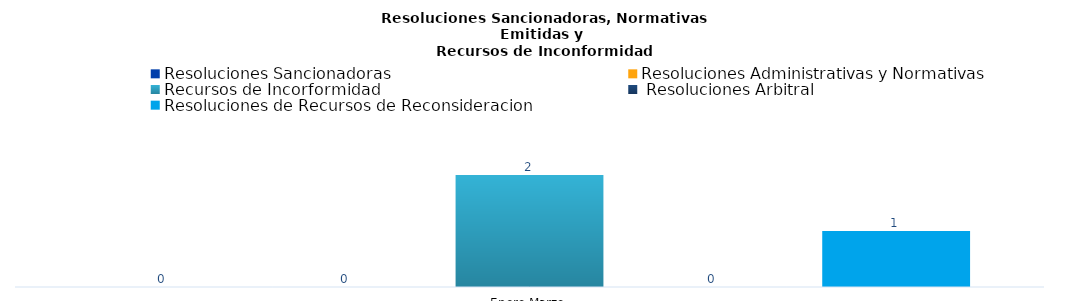
| Category | Resoluciones Sancionadoras | Resoluciones Administrativas y Normativas | Recursos de Incorformidad |  Resoluciones Arbitral | Resoluciones de Recursos de Reconsideracion |
|---|---|---|---|---|---|
| Enero-Marzo | 0 | 0 | 2 | 0 | 1 |